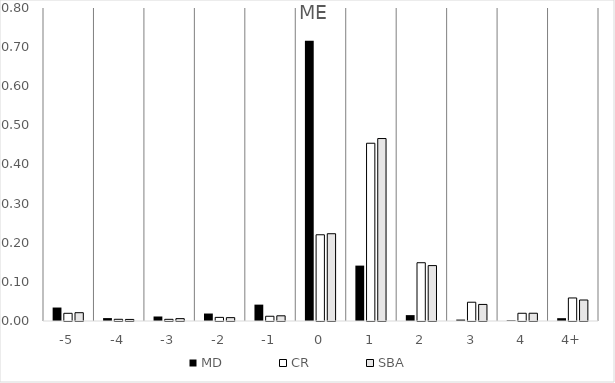
| Category | MD | CR | SBA |
|---|---|---|---|
| -5 | 0.034 | 0.02 | 0.021 |
| -4 | 0.007 | 0.004 | 0.004 |
| -3 | 0.012 | 0.004 | 0.006 |
| -2 | 0.019 | 0.009 | 0.009 |
| -1 | 0.042 | 0.012 | 0.013 |
| 0 | 0.716 | 0.22 | 0.223 |
| 1 | 0.142 | 0.454 | 0.466 |
| 2 | 0.015 | 0.149 | 0.142 |
| 3 | 0.004 | 0.048 | 0.042 |
| 4 | 0.002 | 0.02 | 0.02 |
| 4+ | 0.007 | 0.059 | 0.054 |